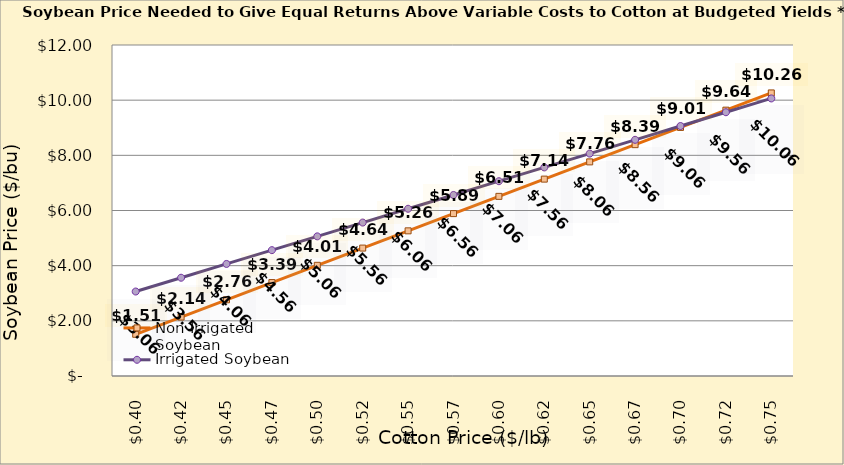
| Category | Non Irrigated Soybean | Irrigated Soybean |
|---|---|---|
| 0.3949999999999998 | 1.513 | 3.063 |
| 0.4199999999999998 | 2.138 | 3.563 |
| 0.44499999999999984 | 2.763 | 4.063 |
| 0.46999999999999986 | 3.388 | 4.563 |
| 0.4949999999999999 | 4.013 | 5.063 |
| 0.5199999999999999 | 4.638 | 5.563 |
| 0.5449999999999999 | 5.263 | 6.063 |
| 0.57 | 5.888 | 6.563 |
| 0.595 | 6.513 | 7.063 |
| 0.62 | 7.138 | 7.563 |
| 0.645 | 7.763 | 8.063 |
| 0.67 | 8.388 | 8.563 |
| 0.6950000000000001 | 9.013 | 9.063 |
| 0.7200000000000001 | 9.638 | 9.563 |
| 0.7450000000000001 | 10.263 | 10.063 |